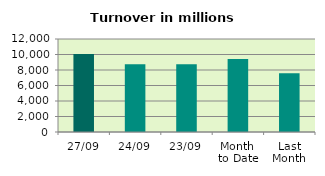
| Category | Series 0 |
|---|---|
| 27/09 | 10062.001 |
| 24/09 | 8729.614 |
| 23/09 | 8748.843 |
| Month 
to Date | 9408.735 |
| Last
Month | 7565.704 |